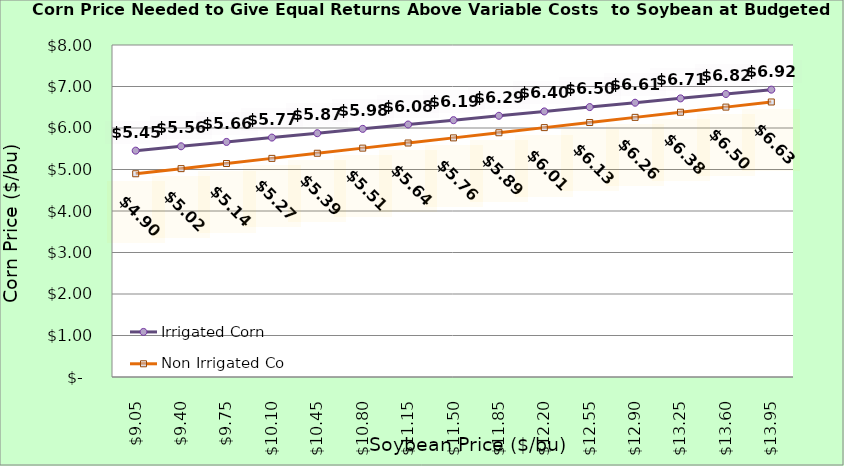
| Category | Irrigated Corn | Non Irrigated Corn |
|---|---|---|
| 9.050000000000002 | 5.454 | 4.897 |
| 9.400000000000002 | 5.559 | 5.021 |
| 9.750000000000002 | 5.664 | 5.144 |
| 10.100000000000001 | 5.769 | 5.268 |
| 10.450000000000001 | 5.874 | 5.391 |
| 10.8 | 5.979 | 5.515 |
| 11.15 | 6.084 | 5.638 |
| 11.5 | 6.189 | 5.762 |
| 11.85 | 6.294 | 5.886 |
| 12.2 | 6.399 | 6.009 |
| 12.549999999999999 | 6.504 | 6.133 |
| 12.899999999999999 | 6.609 | 6.256 |
| 13.249999999999998 | 6.714 | 6.38 |
| 13.599999999999998 | 6.819 | 6.503 |
| 13.949999999999998 | 6.924 | 6.627 |